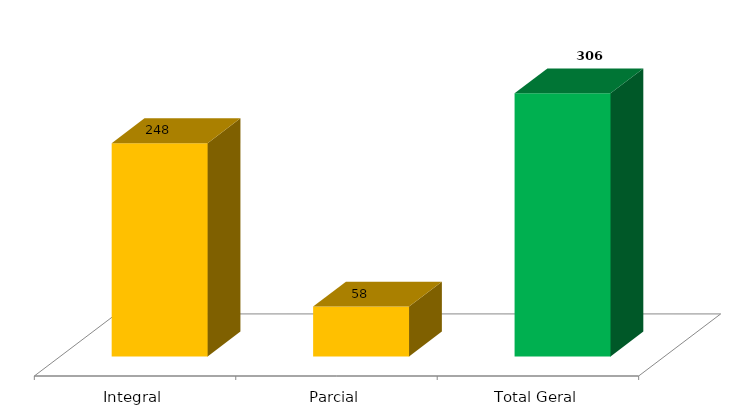
| Category | Categoria/Ano |
|---|---|
| Integral | 248 |
| Parcial | 58 |
| Total Geral | 306 |